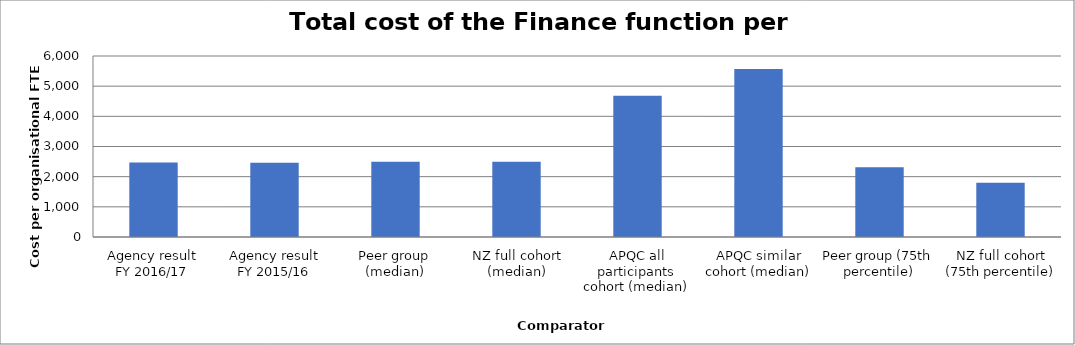
| Category | Result |
|---|---|
| Agency result
FY 2016/17 | 2469.7 |
| Agency result
FY 2015/16 | 2463.501 |
| Peer group (median) | 2490.8 |
| NZ full cohort (median) | 2490.8 |
| APQC all participants cohort (median) | 4679 |
| APQC similar cohort (median) | 5571 |
| Peer group (75th percentile) | 2314.554 |
| NZ full cohort (75th percentile) | 1801.8 |